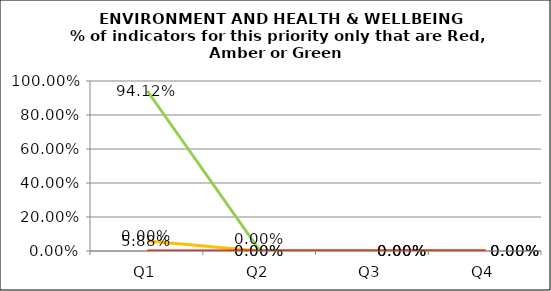
| Category | Green | Amber | Red |
|---|---|---|---|
| Q1 | 0.941 | 0.059 | 0 |
| Q2 | 0 | 0 | 0 |
| Q3 | 0 | 0 | 0 |
| Q4 | 0 | 0 | 0 |